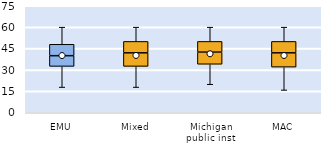
| Category | 25th | 50th | 75th |
|---|---|---|---|
| EMU | 32.5 | 7.5 | 8 |
| Mixed | 32.5 | 9.5 | 8 |
| Michigan public inst | 34 | 8.5 | 7.5 |
| MAC | 32 | 10 | 8 |